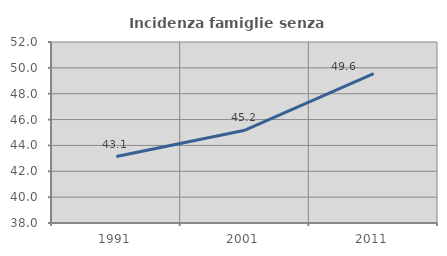
| Category | Incidenza famiglie senza nuclei |
|---|---|
| 1991.0 | 43.137 |
| 2001.0 | 45.175 |
| 2011.0 | 49.561 |